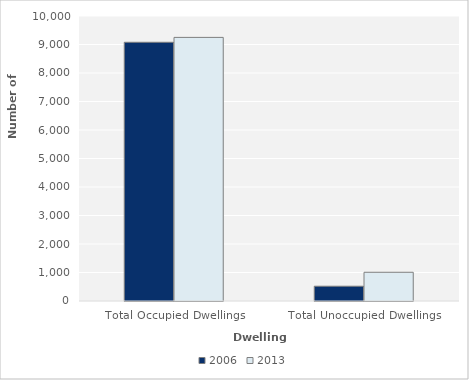
| Category | 2006 | 2013 |
|---|---|---|
| Total Occupied Dwellings | 9078 | 9249 |
| Total Unoccupied Dwellings | 519 | 1008 |